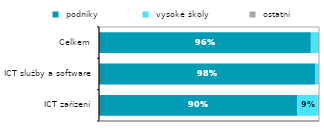
| Category |  podniky  |  vysoké školy |  ostatní  |
|---|---|---|---|
|   ICT zařízení | 0.902 | 0.092 | 0.007 |
|  ICT služby a software | 0.984 | 0.012 | 0.003 |
| Celkem | 0.963 | 0.033 | 0.004 |